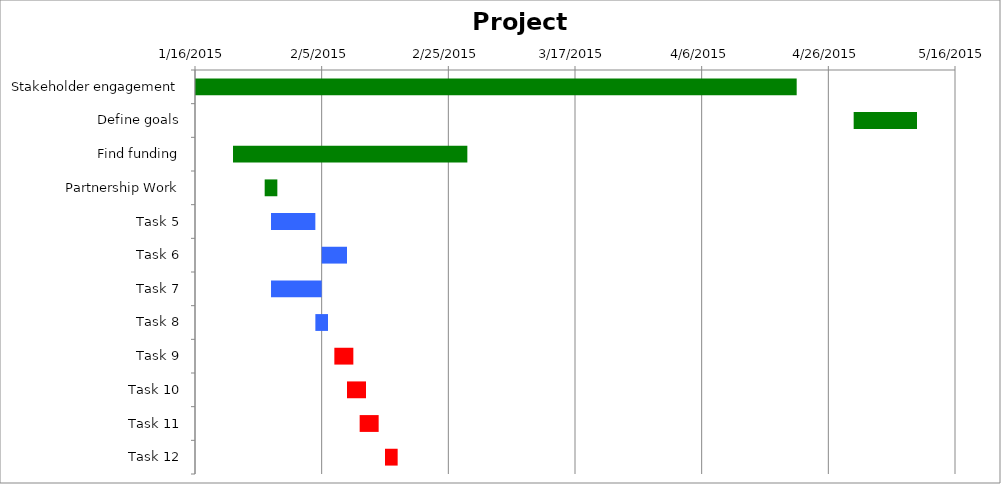
| Category | Start | Duration (days) |
|---|---|---|
| Stakeholder engagement | 1/16/15 | 95 |
| Define goals | 4/30/15 | 10 |
| Find funding | 1/22/15 | 37 |
| Partnership Work | 1/27/15 | 2 |
| Task 5 | 1/28/15 | 7 |
| Task 6 | 2/5/15 | 4 |
| Task 7 | 1/28/15 | 8 |
| Task 8 | 2/4/15 | 2 |
| Task 9 | 2/7/15 | 3 |
| Task 10 | 2/9/15 | 3 |
| Task 11 | 2/11/15 | 3 |
| Task 12 | 2/15/15 | 2 |